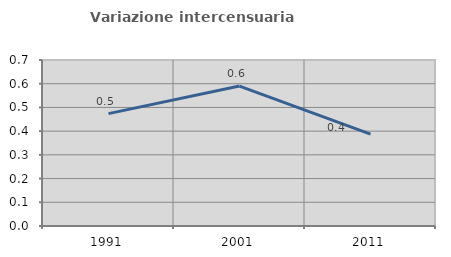
| Category | Variazione intercensuaria annua |
|---|---|
| 1991.0 | 0.474 |
| 2001.0 | 0.59 |
| 2011.0 | 0.388 |